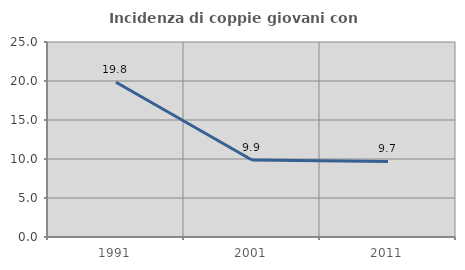
| Category | Incidenza di coppie giovani con figli |
|---|---|
| 1991.0 | 19.841 |
| 2001.0 | 9.871 |
| 2011.0 | 9.692 |